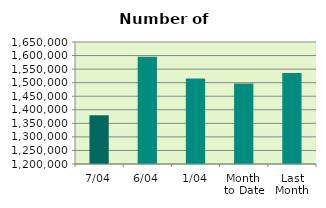
| Category | Series 0 |
|---|---|
| 7/04 | 1379756 |
| 6/04 | 1595192 |
| 1/04 | 1515240 |
| Month 
to Date | 1496729.333 |
| Last
Month | 1535393.739 |